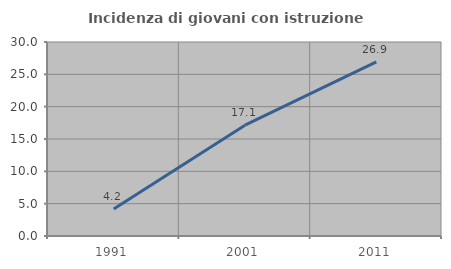
| Category | Incidenza di giovani con istruzione universitaria |
|---|---|
| 1991.0 | 4.167 |
| 2001.0 | 17.143 |
| 2011.0 | 26.923 |